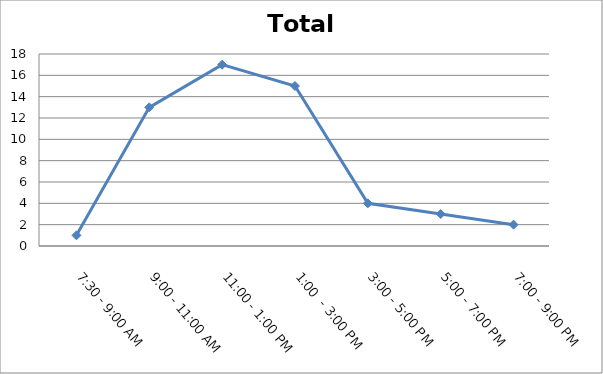
| Category | Total |
|---|---|
| 7:30 - 9:00 AM | 1 |
| 9:00 - 11:00 AM | 13 |
| 11:00 - 1:00 PM | 17 |
| 1:00  - 3:00 PM | 15 |
| 3:00 - 5:00 PM | 4 |
| 5:00 - 7:00 PM | 3 |
| 7:00 - 9:00 PM | 2 |